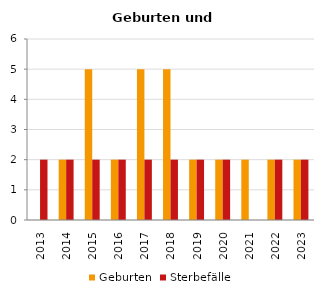
| Category | Geburten | Sterbefälle |
|---|---|---|
| 2013.0 | 0 | 2 |
| 2014.0 | 2 | 2 |
| 2015.0 | 5 | 2 |
| 2016.0 | 2 | 2 |
| 2017.0 | 5 | 2 |
| 2018.0 | 5 | 2 |
| 2019.0 | 2 | 2 |
| 2020.0 | 2 | 2 |
| 2021.0 | 2 | 0 |
| 2022.0 | 2 | 2 |
| 2023.0 | 2 | 2 |